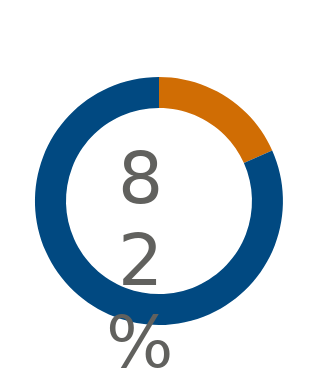
| Category | Series 0 |
|---|---|
| 0 | 0.183 |
| 1 | 0.817 |